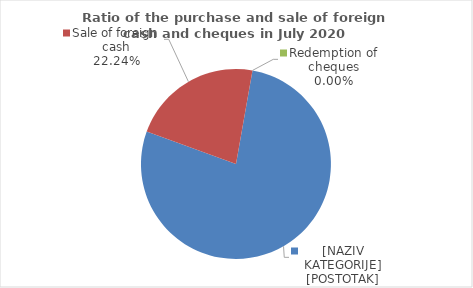
| Category | Series 0 |
|---|---|
| Purchase of foreign cash | 77.76 |
| Sale of foreign cash | 22.24 |
| Redemption of cheques | 0 |